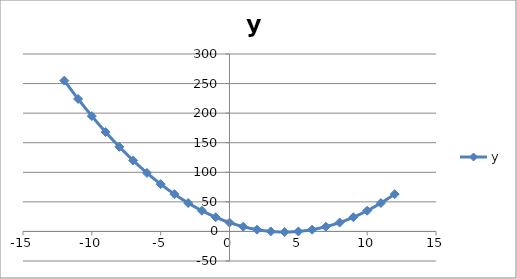
| Category | y |
|---|---|
| 12.0 | 63 |
| 11.0 | 48 |
| 10.0 | 35 |
| 9.0 | 24 |
| 8.0 | 15 |
| 7.0 | 8 |
| 6.0 | 3 |
| 5.0 | 0 |
| 4.0 | -1 |
| 3.0 | 0 |
| 2.0 | 3 |
| 1.0 | 8 |
| 0.0 | 15 |
| -1.0 | 24 |
| -2.0 | 35 |
| -3.0 | 48 |
| -4.0 | 63 |
| -5.0 | 80 |
| -6.0 | 99 |
| -7.0 | 120 |
| -8.0 | 143 |
| -9.0 | 168 |
| -10.0 | 195 |
| -11.0 | 224 |
| -12.0 | 255 |